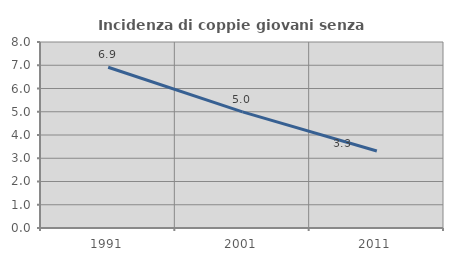
| Category | Incidenza di coppie giovani senza figli |
|---|---|
| 1991.0 | 6.916 |
| 2001.0 | 4.997 |
| 2011.0 | 3.315 |